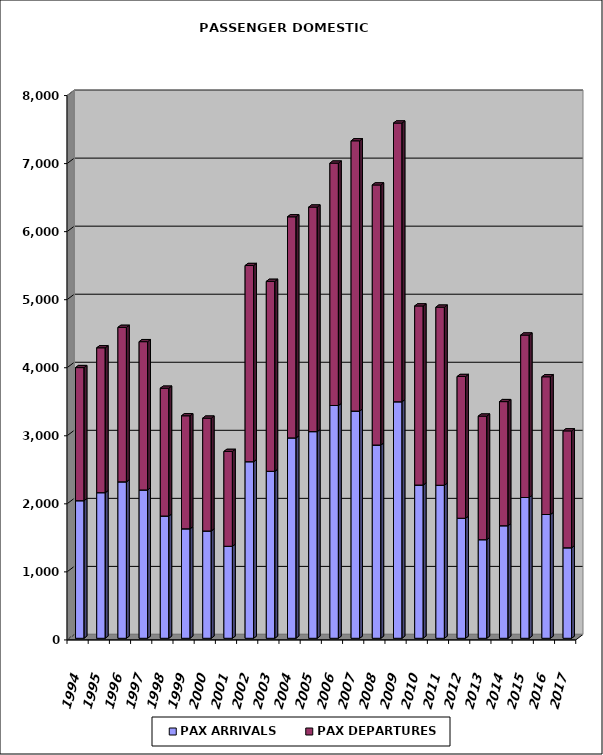
| Category | PAX ARRIVALS | PAX DEPARTURES |
|---|---|---|
| 1994.0 | 2022 | 1956 |
| 1995.0 | 2140 | 2129 |
| 1996.0 | 2299 | 2270 |
| 1997.0 | 2180 | 2179 |
| 1998.0 | 1797 | 1878 |
| 1999.0 | 1609 | 1661 |
| 2000.0 | 1577 | 1658 |
| 2001.0 | 1352 | 1394 |
| 2002.0 | 2595 | 2883 |
| 2003.0 | 2454 | 2791 |
| 2004.0 | 2945 | 3249 |
| 2005.0 | 3037 | 3300 |
| 2006.0 | 3421 | 3562 |
| 2007.0 | 3339 | 3972 |
| 2008.0 | 2840 | 3822 |
| 2009.0 | 3476 | 4096 |
| 2010.0 | 2252 | 2632 |
| 2011.0 | 2249 | 2617 |
| 2012.0 | 1764 | 2083 |
| 2013.0 | 1449 | 1816 |
| 2014.0 | 1654 | 1824 |
| 2015.0 | 2069 | 2387 |
| 2016.0 | 1819 | 2024 |
| 2017.0 | 1330 | 1718 |